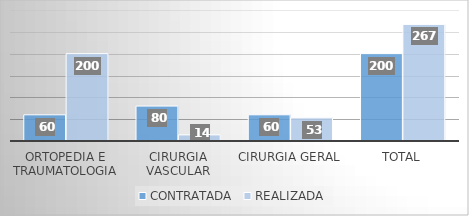
| Category | CONTRATADA | REALIZADA |
|---|---|---|
| Ortopedia e traumatologia | 60 | 200 |
| Cirurgia vascular | 80 | 14 |
| Cirurgia Geral | 60 | 53 |
| TOTAL | 200 | 267 |